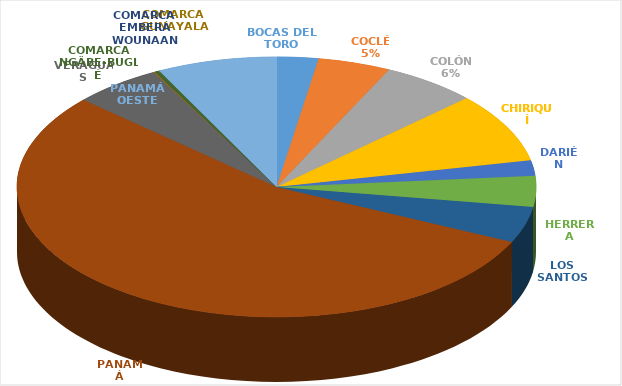
| Category | Cantidad  |
|---|---|
| BOCAS DEL TORO | 153 |
| COCLÉ | 268 |
| COLÓN | 349 |
| CHIRIQUÍ | 512 |
| DARIÉN | 112 |
| HERRERA | 227 |
| LOS SANTOS | 265 |
| PANAMÁ | 3230 |
| VERAGUAS | 324 |
| COMARCA GUNAYALA | 6 |
| COMARCA EMBERÁ WOUNAAN | 1 |
| COMARCA NGÄBE-BUGLÉ | 15 |
| PANAMÁ OESTE | 440 |